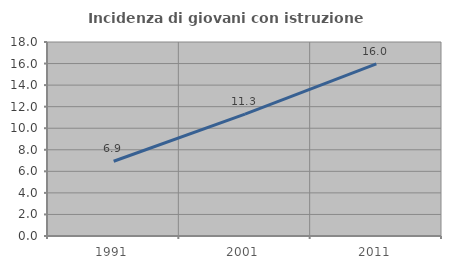
| Category | Incidenza di giovani con istruzione universitaria |
|---|---|
| 1991.0 | 6.936 |
| 2001.0 | 11.303 |
| 2011.0 | 15.979 |